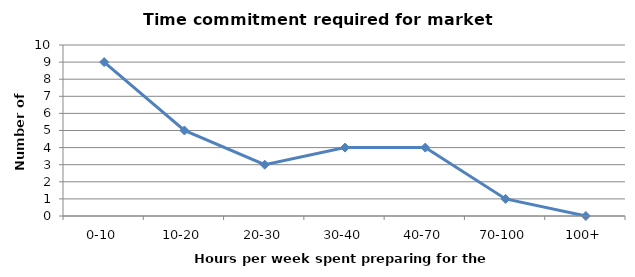
| Category | Series 0 |
|---|---|
| 0-10 | 9 |
| 10-20 | 5 |
| 20-30 | 3 |
| 30-40 | 4 |
| 40-70 | 4 |
| 70-100 | 1 |
| 100+ | 0 |